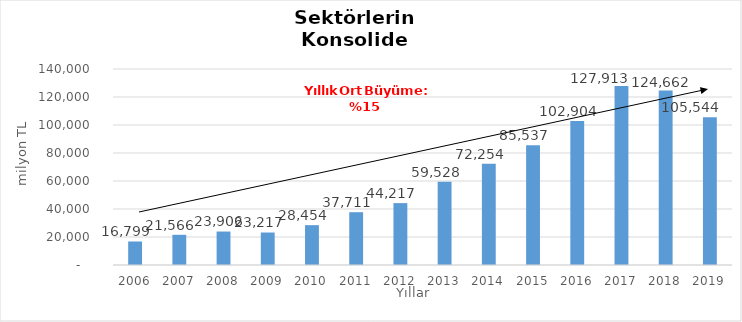
| Category | Toplam |
|---|---|
| 2006.0 | 16799.249 |
| 2007.0 | 21566.057 |
| 2008.0 | 23906.328 |
| 2009.0 | 23216.54 |
| 2010.0 | 28454.489 |
| 2011.0 | 37710.665 |
| 2012.0 | 44216.529 |
| 2013.0 | 59528.288 |
| 2014.0 | 72253.719 |
| 2015.0 | 85537 |
| 2016.0 | 102904 |
| 2017.0 | 127913 |
| 2018.0 | 124662 |
| 2019.0 | 105544 |